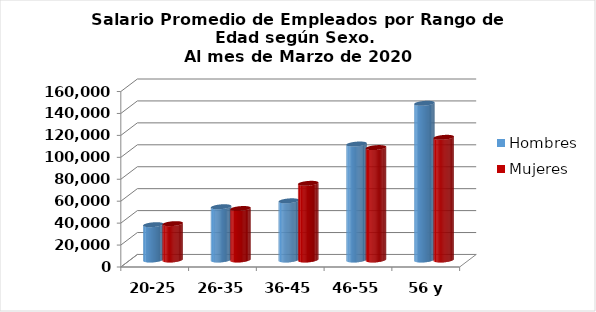
| Category | Hombres | Mujeres |
|---|---|---|
| 20-25 | 32190.714 | 33140.273 |
| 26-35 | 48551.267 | 46924.59 |
| 36-45 | 53964.131 | 69911.378 |
| 46-55 | 105749.379 | 102490.523 |
| 56 y más | 142904.517 | 111850.38 |